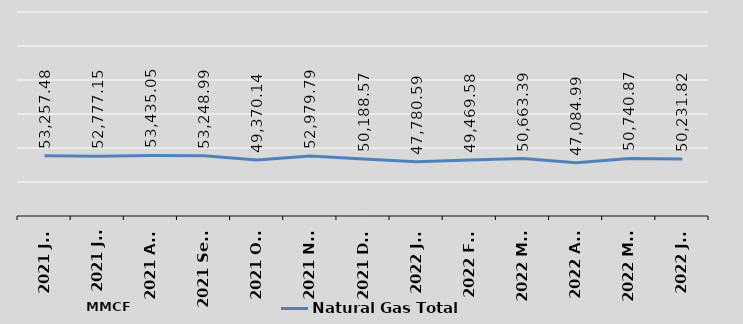
| Category | Natural Gas Total |
|---|---|
| 2021 Jun | 53257.48 |
| 2021 Jul | 52777.15 |
| 2021 Aug | 53435.05 |
| 2021 Sept | 53248.99 |
| 2021 Oct | 49370.14 |
| 2021 Nov | 52979.79 |
| 2021 Dec | 50188.57 |
| 2022 Jan | 47780.59 |
| 2022 Feb | 49469.58 |
| 2022 Mar | 50663.39 |
| 2022 Apr | 47084.99 |
| 2022 May | 50740.87 |
| 2022 Jun | 50231.82 |